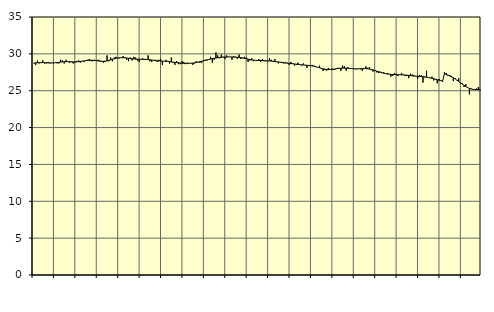
| Category | Piggar | Series 1 |
|---|---|---|
| nan | 28.7 | 28.77 |
| 1.0 | 28.5 | 28.78 |
| 1.0 | 29.1 | 28.8 |
| 1.0 | 28.7 | 28.8 |
| 1.0 | 28.8 | 28.81 |
| 1.0 | 29.1 | 28.81 |
| 1.0 | 28.7 | 28.8 |
| 1.0 | 28.7 | 28.79 |
| 1.0 | 28.9 | 28.78 |
| 1.0 | 28.7 | 28.77 |
| 1.0 | 28.8 | 28.77 |
| 1.0 | 28.7 | 28.78 |
| nan | 28.8 | 28.8 |
| 2.0 | 28.7 | 28.83 |
| 2.0 | 28.7 | 28.86 |
| 2.0 | 29.2 | 28.89 |
| 2.0 | 29.1 | 28.91 |
| 2.0 | 28.7 | 28.93 |
| 2.0 | 29.2 | 28.94 |
| 2.0 | 28.9 | 28.94 |
| 2.0 | 28.8 | 28.93 |
| 2.0 | 29 | 28.92 |
| 2.0 | 28.7 | 28.91 |
| 2.0 | 28.8 | 28.91 |
| nan | 29 | 28.92 |
| 3.0 | 29.1 | 28.95 |
| 3.0 | 28.8 | 28.97 |
| 3.0 | 29 | 29.01 |
| 3.0 | 28.9 | 29.04 |
| 3.0 | 29.1 | 29.08 |
| 3.0 | 29.2 | 29.11 |
| 3.0 | 29.3 | 29.13 |
| 3.0 | 29 | 29.14 |
| 3.0 | 29 | 29.13 |
| 3.0 | 29.2 | 29.11 |
| 3.0 | 29.1 | 29.07 |
| nan | 29.2 | 29.04 |
| 4.0 | 29.1 | 29.01 |
| 4.0 | 28.9 | 28.99 |
| 4.0 | 28.8 | 28.99 |
| 4.0 | 28.9 | 29.01 |
| 4.0 | 29.8 | 29.05 |
| 4.0 | 29 | 29.11 |
| 4.0 | 29.5 | 29.18 |
| 4.0 | 29 | 29.26 |
| 4.0 | 29.5 | 29.33 |
| 4.0 | 29.6 | 29.4 |
| 4.0 | 29.4 | 29.44 |
| nan | 29.4 | 29.47 |
| 5.0 | 29.5 | 29.48 |
| 5.0 | 29.7 | 29.48 |
| 5.0 | 29.5 | 29.46 |
| 5.0 | 29.2 | 29.44 |
| 5.0 | 29 | 29.4 |
| 5.0 | 29.5 | 29.37 |
| 5.0 | 29.1 | 29.33 |
| 5.0 | 29.6 | 29.31 |
| 5.0 | 29.5 | 29.29 |
| 5.0 | 29.1 | 29.28 |
| 5.0 | 28.9 | 29.27 |
| nan | 29.3 | 29.27 |
| 6.0 | 29.4 | 29.26 |
| 6.0 | 29.2 | 29.26 |
| 6.0 | 29.2 | 29.24 |
| 6.0 | 29.8 | 29.22 |
| 6.0 | 29 | 29.2 |
| 6.0 | 28.9 | 29.17 |
| 6.0 | 29.1 | 29.13 |
| 6.0 | 29.2 | 29.1 |
| 6.0 | 28.9 | 29.06 |
| 6.0 | 29.2 | 29.04 |
| 6.0 | 29.3 | 29.02 |
| nan | 28.5 | 29.01 |
| 7.0 | 29 | 29 |
| 7.0 | 29.2 | 28.99 |
| 7.0 | 28.9 | 28.97 |
| 7.0 | 28.7 | 28.94 |
| 7.0 | 29.5 | 28.91 |
| 7.0 | 28.8 | 28.88 |
| 7.0 | 28.5 | 28.85 |
| 7.0 | 29 | 28.82 |
| 7.0 | 28.6 | 28.79 |
| 7.0 | 28.6 | 28.76 |
| 7.0 | 29 | 28.74 |
| nan | 28.9 | 28.72 |
| 8.0 | 28.6 | 28.71 |
| 8.0 | 28.8 | 28.71 |
| 8.0 | 28.7 | 28.72 |
| 8.0 | 28.7 | 28.73 |
| 8.0 | 28.5 | 28.75 |
| 8.0 | 28.7 | 28.78 |
| 8.0 | 29 | 28.82 |
| 8.0 | 28.9 | 28.87 |
| 8.0 | 28.8 | 28.93 |
| 8.0 | 28.8 | 28.99 |
| 8.0 | 29.1 | 29.06 |
| nan | 29.2 | 29.12 |
| 9.0 | 29.1 | 29.18 |
| 9.0 | 29.2 | 29.24 |
| 9.0 | 29.6 | 29.29 |
| 9.0 | 28.8 | 29.34 |
| 9.0 | 29.2 | 29.39 |
| 9.0 | 30.2 | 29.43 |
| 9.0 | 29.8 | 29.47 |
| 9.0 | 29.4 | 29.51 |
| 9.0 | 29.9 | 29.53 |
| 9.0 | 29.6 | 29.55 |
| 9.0 | 29.3 | 29.57 |
| nan | 29.8 | 29.57 |
| 10.0 | 29.6 | 29.58 |
| 10.0 | 29.6 | 29.58 |
| 10.0 | 29.2 | 29.57 |
| 10.0 | 29.7 | 29.56 |
| 10.0 | 29.6 | 29.55 |
| 10.0 | 29.3 | 29.54 |
| 10.0 | 29.9 | 29.51 |
| 10.0 | 29.3 | 29.48 |
| 10.0 | 29.5 | 29.44 |
| 10.0 | 29.6 | 29.39 |
| 10.0 | 29.5 | 29.33 |
| nan | 28.9 | 29.28 |
| 11.0 | 29.1 | 29.22 |
| 11.0 | 29.4 | 29.18 |
| 11.0 | 29 | 29.15 |
| 11.0 | 29.1 | 29.12 |
| 11.0 | 29.1 | 29.1 |
| 11.0 | 29.3 | 29.1 |
| 11.0 | 28.9 | 29.09 |
| 11.0 | 29.3 | 29.09 |
| 11.0 | 29 | 29.08 |
| 11.0 | 29 | 29.07 |
| 11.0 | 29 | 29.06 |
| nan | 29.4 | 29.04 |
| 12.0 | 29.2 | 29.02 |
| 12.0 | 28.9 | 28.99 |
| 12.0 | 29.3 | 28.96 |
| 12.0 | 28.9 | 28.93 |
| 12.0 | 28.7 | 28.9 |
| 12.0 | 28.9 | 28.87 |
| 12.0 | 28.9 | 28.83 |
| 12.0 | 28.7 | 28.8 |
| 12.0 | 28.9 | 28.76 |
| 12.0 | 28.8 | 28.73 |
| 12.0 | 28.5 | 28.71 |
| nan | 28.9 | 28.68 |
| 13.0 | 28.7 | 28.66 |
| 13.0 | 28.4 | 28.63 |
| 13.0 | 28.5 | 28.6 |
| 13.0 | 28.8 | 28.57 |
| 13.0 | 28.5 | 28.54 |
| 13.0 | 28.4 | 28.51 |
| 13.0 | 28.7 | 28.49 |
| 13.0 | 28.5 | 28.47 |
| 13.0 | 28.1 | 28.45 |
| 13.0 | 28.4 | 28.43 |
| 13.0 | 28.4 | 28.4 |
| nan | 28.5 | 28.36 |
| 14.0 | 28.4 | 28.31 |
| 14.0 | 28.2 | 28.25 |
| 14.0 | 28.2 | 28.18 |
| 14.0 | 28.4 | 28.11 |
| 14.0 | 28 | 28.04 |
| 14.0 | 27.7 | 27.98 |
| 14.0 | 27.8 | 27.93 |
| 14.0 | 27.7 | 27.89 |
| 14.0 | 28.1 | 27.87 |
| 14.0 | 27.9 | 27.88 |
| 14.0 | 28 | 27.9 |
| nan | 27.8 | 27.93 |
| 15.0 | 27.9 | 27.96 |
| 15.0 | 28.1 | 28 |
| 15.0 | 28.1 | 28.03 |
| 15.0 | 27.7 | 28.05 |
| 15.0 | 28.4 | 28.06 |
| 15.0 | 28.3 | 28.06 |
| 15.0 | 27.7 | 28.06 |
| 15.0 | 28.2 | 28.05 |
| 15.0 | 28 | 28.02 |
| 15.0 | 28 | 28 |
| 15.0 | 28 | 27.97 |
| nan | 27.9 | 27.96 |
| 16.0 | 28 | 27.96 |
| 16.0 | 28 | 27.97 |
| 16.0 | 27.9 | 27.98 |
| 16.0 | 27.7 | 27.99 |
| 16.0 | 28 | 28 |
| 16.0 | 28.3 | 28 |
| 16.0 | 28.1 | 27.97 |
| 16.0 | 28.2 | 27.94 |
| 16.0 | 27.8 | 27.88 |
| 16.0 | 27.6 | 27.82 |
| 16.0 | 27.8 | 27.74 |
| nan | 27.5 | 27.66 |
| 17.0 | 27.4 | 27.58 |
| 17.0 | 27.6 | 27.5 |
| 17.0 | 27.4 | 27.43 |
| 17.0 | 27.5 | 27.37 |
| 17.0 | 27.3 | 27.31 |
| 17.0 | 27.4 | 27.27 |
| 17.0 | 27.2 | 27.24 |
| 17.0 | 26.9 | 27.22 |
| 17.0 | 27 | 27.2 |
| 17.0 | 27.4 | 27.18 |
| 17.0 | 27.3 | 27.17 |
| nan | 27 | 27.16 |
| 18.0 | 27.2 | 27.16 |
| 18.0 | 27.4 | 27.15 |
| 18.0 | 27.2 | 27.14 |
| 18.0 | 27 | 27.13 |
| 18.0 | 27 | 27.11 |
| 18.0 | 26.7 | 27.08 |
| 18.0 | 27.3 | 27.05 |
| 18.0 | 27.2 | 27.02 |
| 18.0 | 27.1 | 26.99 |
| 18.0 | 27 | 26.97 |
| 18.0 | 26.6 | 26.95 |
| nan | 27.1 | 26.94 |
| 19.0 | 27.1 | 26.92 |
| 19.0 | 26.1 | 26.9 |
| 19.0 | 26.8 | 26.88 |
| 19.0 | 27.7 | 26.84 |
| 19.0 | 26.8 | 26.8 |
| 19.0 | 26.7 | 26.75 |
| 19.0 | 26.9 | 26.69 |
| 19.0 | 26.4 | 26.63 |
| 19.0 | 26.6 | 26.56 |
| 19.0 | 26 | 26.49 |
| 19.0 | 26.6 | 26.43 |
| nan | 26.4 | 26.36 |
| 20.0 | 26.2 | 26.3 |
| 20.0 | 27.5 | 27.32 |
| 20.0 | 27.4 | 27.2 |
| 20.0 | 27 | 27.11 |
| 20.0 | 27.1 | 26.99 |
| 20.0 | 27 | 26.88 |
| 20.0 | 26.3 | 26.75 |
| 20.0 | 26.7 | 26.6 |
| 20.0 | 26.4 | 26.44 |
| 20.0 | 26.7 | 26.26 |
| 20.0 | 26 | 26.08 |
| nan | 26 | 25.9 |
| 21.0 | 25.5 | 25.72 |
| 21.0 | 25.9 | 25.56 |
| 21.0 | 25.4 | 25.43 |
| 21.0 | 24.5 | 25.32 |
| 21.0 | 25.3 | 25.24 |
| 21.0 | 25.2 | 25.19 |
| 21.0 | 25.2 | 25.17 |
| 21.0 | 25.3 | 25.16 |
| 21.0 | 25.5 | 25.15 |
| 21.0 | 25 | 25.14 |